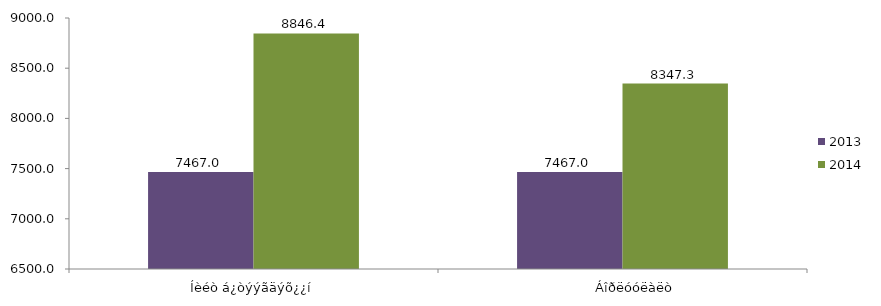
| Category | 2013 | 2014 |
|---|---|---|
| Íèéò á¿òýýãäýõ¿¿í | 7466.997 | 8846.406 |
|        Áîðëóóëàëò | 7466.997 | 8347.265 |